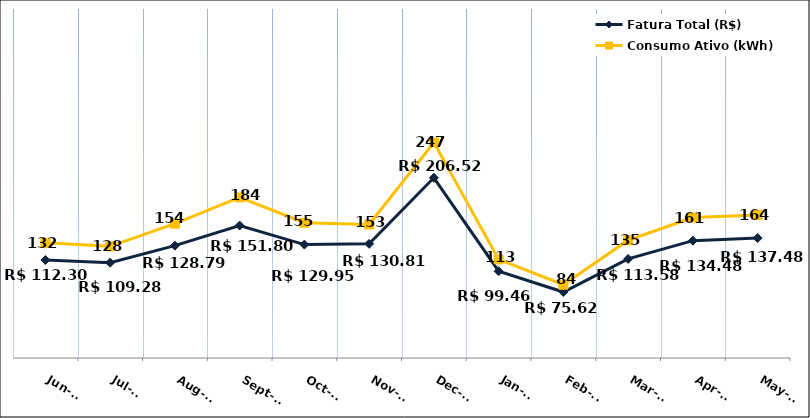
| Category | Fatura Total (R$) |
|---|---|
| 2023-06-01 | 112.3 |
| 2023-07-01 | 109.28 |
| 2023-08-01 | 128.79 |
| 2023-09-01 | 151.8 |
| 2023-10-01 | 129.95 |
| 2023-11-01 | 130.81 |
| 2023-12-01 | 206.52 |
| 2024-01-01 | 99.46 |
| 2024-02-01 | 75.62 |
| 2024-03-01 | 113.58 |
| 2024-04-01 | 134.48 |
| 2024-05-01 | 137.48 |